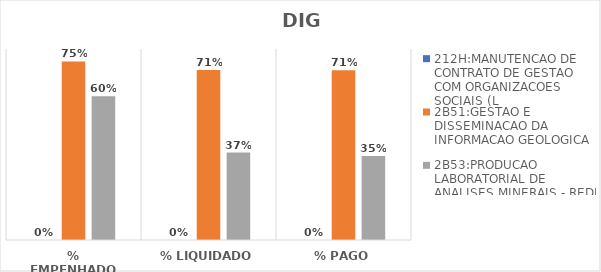
| Category | 212H:MANUTENCAO DE CONTRATO DE GESTAO COM ORGANIZACOES SOCIAIS (L | 2B51:GESTAO E DISSEMINACAO DA INFORMACAO GEOLOGICA | 2B53:PRODUCAO LABORATORIAL DE ANALISES MINERAIS - REDE LAMIN |
|---|---|---|---|
| % EMPENHADO | 0 | 0.748 | 0.602 |
| % LIQUIDADO | 0 | 0.712 | 0.366 |
| % PAGO | 0 | 0.711 | 0.352 |